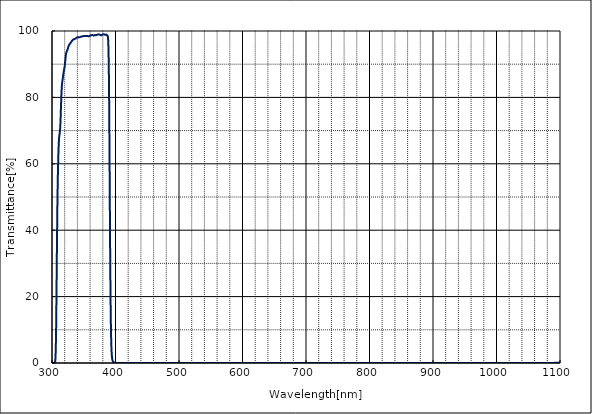
| Category | T% at AOI 0 deg |
|---|---|
| 1100.0 | 0.051 |
| 1099.5 | 0.054 |
| 1099.0 | 0.058 |
| 1098.5 | 0.06 |
| 1098.0 | 0.064 |
| 1097.5 | 0.065 |
| 1097.0 | 0.068 |
| 1096.5 | 0.069 |
| 1096.0 | 0.071 |
| 1095.5 | 0.07 |
| 1095.0 | 0.068 |
| 1094.5 | 0.066 |
| 1094.0 | 0.063 |
| 1093.5 | 0.056 |
| 1093.0 | 0.053 |
| 1092.5 | 0.047 |
| 1092.0 | 0.043 |
| 1091.5 | 0.039 |
| 1091.0 | 0.036 |
| 1090.5 | 0.03 |
| 1090.0 | 0.029 |
| 1089.5 | 0.026 |
| 1089.0 | 0.024 |
| 1088.5 | 0.022 |
| 1088.0 | 0.019 |
| 1087.5 | 0.018 |
| 1087.0 | 0.014 |
| 1086.5 | 0.015 |
| 1086.0 | 0.016 |
| 1085.5 | 0.013 |
| 1085.0 | 0.011 |
| 1084.5 | 0.01 |
| 1084.0 | 0.011 |
| 1083.5 | 0.011 |
| 1083.0 | 0.009 |
| 1082.5 | 0.009 |
| 1082.0 | 0.008 |
| 1081.5 | 0.008 |
| 1081.0 | 0.007 |
| 1080.5 | 0.006 |
| 1080.0 | 0.007 |
| 1079.5 | 0.008 |
| 1079.0 | 0.006 |
| 1078.5 | 0.005 |
| 1078.0 | 0.006 |
| 1077.5 | 0.005 |
| 1077.0 | 0.005 |
| 1076.5 | 0.005 |
| 1076.0 | 0.005 |
| 1075.5 | 0.005 |
| 1075.0 | 0.004 |
| 1074.5 | 0.006 |
| 1074.0 | 0.005 |
| 1073.5 | 0.004 |
| 1073.0 | 0.005 |
| 1072.5 | 0.005 |
| 1072.0 | 0.005 |
| 1071.5 | 0.005 |
| 1071.0 | 0.005 |
| 1070.5 | 0.005 |
| 1070.0 | 0.005 |
| 1069.5 | 0.005 |
| 1069.0 | 0.005 |
| 1068.5 | 0.005 |
| 1068.0 | 0.005 |
| 1067.5 | 0.004 |
| 1067.0 | 0.005 |
| 1066.5 | 0.006 |
| 1066.0 | 0.005 |
| 1065.5 | 0.005 |
| 1065.0 | 0.004 |
| 1064.5 | 0.006 |
| 1064.0 | 0.005 |
| 1063.5 | 0.006 |
| 1063.0 | 0.005 |
| 1062.5 | 0.004 |
| 1062.0 | 0.004 |
| 1061.5 | 0.005 |
| 1061.0 | 0.007 |
| 1060.5 | 0.006 |
| 1060.0 | 0.007 |
| 1059.5 | 0.006 |
| 1059.0 | 0.004 |
| 1058.5 | 0.006 |
| 1058.0 | 0.006 |
| 1057.5 | 0.007 |
| 1057.0 | 0.007 |
| 1056.5 | 0.006 |
| 1056.0 | 0.007 |
| 1055.5 | 0.008 |
| 1055.0 | 0.008 |
| 1054.5 | 0.006 |
| 1054.0 | 0.009 |
| 1053.5 | 0.008 |
| 1053.0 | 0.009 |
| 1052.5 | 0.01 |
| 1052.0 | 0.009 |
| 1051.5 | 0.009 |
| 1051.0 | 0.01 |
| 1050.5 | 0.011 |
| 1050.0 | 0.01 |
| 1049.5 | 0.01 |
| 1049.0 | 0.011 |
| 1048.5 | 0.011 |
| 1048.0 | 0.01 |
| 1047.5 | 0.012 |
| 1047.0 | 0.011 |
| 1046.5 | 0.011 |
| 1046.0 | 0.011 |
| 1045.5 | 0.011 |
| 1045.0 | 0.009 |
| 1044.5 | 0.01 |
| 1044.0 | 0.01 |
| 1043.5 | 0.007 |
| 1043.0 | 0.007 |
| 1042.5 | 0.008 |
| 1042.0 | 0.005 |
| 1041.5 | 0.005 |
| 1041.0 | 0.005 |
| 1040.5 | 0.005 |
| 1040.0 | 0.004 |
| 1039.5 | 0.005 |
| 1039.0 | 0.003 |
| 1038.5 | 0.002 |
| 1038.0 | 0.003 |
| 1037.5 | 0.003 |
| 1037.0 | 0.002 |
| 1036.5 | 0.003 |
| 1036.0 | 0.002 |
| 1035.5 | 0.002 |
| 1035.0 | 0.002 |
| 1034.5 | 0.002 |
| 1034.0 | 0.001 |
| 1033.5 | 0.001 |
| 1033.0 | 0.003 |
| 1032.5 | 0.003 |
| 1032.0 | 0.001 |
| 1031.5 | 0.001 |
| 1031.0 | 0.001 |
| 1030.5 | 0 |
| 1030.0 | 0.002 |
| 1029.5 | 0.002 |
| 1029.0 | 0 |
| 1028.5 | 0.002 |
| 1028.0 | 0.002 |
| 1027.5 | 0.003 |
| 1027.0 | 0.002 |
| 1026.5 | 0.001 |
| 1026.0 | 0.002 |
| 1025.5 | 0.002 |
| 1025.0 | 0 |
| 1024.5 | 0.002 |
| 1024.0 | 0.001 |
| 1023.5 | 0.003 |
| 1023.0 | 0.002 |
| 1022.5 | 0.001 |
| 1022.0 | 0.004 |
| 1021.5 | 0.003 |
| 1021.0 | 0.003 |
| 1020.5 | 0.002 |
| 1020.0 | 0.004 |
| 1019.5 | 0.003 |
| 1019.0 | 0.004 |
| 1018.5 | 0.004 |
| 1018.0 | 0.007 |
| 1017.5 | 0.007 |
| 1017.0 | 0.01 |
| 1016.5 | 0.011 |
| 1016.0 | 0.012 |
| 1015.5 | 0.014 |
| 1015.0 | 0.017 |
| 1014.5 | 0.019 |
| 1014.0 | 0.018 |
| 1013.5 | 0.017 |
| 1013.0 | 0.015 |
| 1012.5 | 0.012 |
| 1012.0 | 0.01 |
| 1011.5 | 0.008 |
| 1011.0 | 0.008 |
| 1010.5 | 0.004 |
| 1010.0 | 0.005 |
| 1009.5 | 0.005 |
| 1009.0 | 0.003 |
| 1008.5 | 0.004 |
| 1008.0 | 0.003 |
| 1007.5 | 0.002 |
| 1007.0 | 0.002 |
| 1006.5 | 0.002 |
| 1006.0 | 0.001 |
| 1005.5 | 0.002 |
| 1005.0 | 0 |
| 1004.5 | 0.003 |
| 1004.0 | 0.001 |
| 1003.5 | 0.002 |
| 1003.0 | 0.001 |
| 1002.5 | 0.002 |
| 1002.0 | 0.002 |
| 1001.5 | 0 |
| 1001.0 | 0.002 |
| 1000.5 | 0.002 |
| 1000.0 | 0.001 |
| 999.5 | 0.001 |
| 999.0 | 0.001 |
| 998.5 | 0.001 |
| 998.0 | 0.001 |
| 997.5 | 0.001 |
| 997.0 | 0.002 |
| 996.5 | 0.002 |
| 996.0 | 0.001 |
| 995.5 | 0.002 |
| 995.0 | 0.002 |
| 994.5 | 0.003 |
| 994.0 | 0.003 |
| 993.5 | 0.003 |
| 993.0 | 0.003 |
| 992.5 | 0.005 |
| 992.0 | 0.005 |
| 991.5 | 0.005 |
| 991.0 | 0.008 |
| 990.5 | 0.011 |
| 990.0 | 0.014 |
| 989.5 | 0.019 |
| 989.0 | 0.024 |
| 988.5 | 0.024 |
| 988.0 | 0.019 |
| 987.5 | 0.015 |
| 987.0 | 0.01 |
| 986.5 | 0.006 |
| 986.0 | 0.004 |
| 985.5 | 0.004 |
| 985.0 | 0.002 |
| 984.5 | 0.001 |
| 984.0 | 0.002 |
| 983.5 | 0.003 |
| 983.0 | 0.002 |
| 982.5 | 0.002 |
| 982.0 | 0.001 |
| 981.5 | 0.001 |
| 981.0 | 0.001 |
| 980.5 | 0 |
| 980.0 | 0.001 |
| 979.5 | -0.001 |
| 979.0 | 0.001 |
| 978.5 | 0.001 |
| 978.0 | 0.001 |
| 977.5 | 0 |
| 977.0 | 0 |
| 976.5 | 0 |
| 976.0 | 0.002 |
| 975.5 | 0.001 |
| 975.0 | 0 |
| 974.5 | 0 |
| 974.0 | 0 |
| 973.5 | 0.001 |
| 973.0 | 0.001 |
| 972.5 | 0.001 |
| 972.0 | 0 |
| 971.5 | 0.001 |
| 971.0 | 0 |
| 970.5 | -0.001 |
| 970.0 | 0 |
| 969.5 | 0 |
| 969.0 | 0.001 |
| 968.5 | 0 |
| 968.0 | 0 |
| 967.5 | -0.001 |
| 967.0 | -0.001 |
| 966.5 | 0.001 |
| 966.0 | 0.001 |
| 965.5 | 0 |
| 965.0 | 0 |
| 964.5 | 0.001 |
| 964.0 | 0.001 |
| 963.5 | 0 |
| 963.0 | 0 |
| 962.5 | 0 |
| 962.0 | 0 |
| 961.5 | 0.001 |
| 961.0 | 0 |
| 960.5 | 0 |
| 960.0 | 0.001 |
| 959.5 | 0.001 |
| 959.0 | 0.002 |
| 958.5 | 0 |
| 958.0 | 0 |
| 957.5 | 0.001 |
| 957.0 | 0.001 |
| 956.5 | -0.001 |
| 956.0 | -0.001 |
| 955.5 | 0 |
| 955.0 | -0.001 |
| 954.5 | 0 |
| 954.0 | 0.001 |
| 953.5 | 0.001 |
| 953.0 | 0.001 |
| 952.5 | 0.001 |
| 952.0 | 0 |
| 951.5 | 0 |
| 951.0 | 0 |
| 950.5 | 0 |
| 950.0 | 0 |
| 949.5 | -0.001 |
| 949.0 | 0 |
| 948.5 | 0 |
| 948.0 | 0 |
| 947.5 | 0.001 |
| 947.0 | 0 |
| 946.5 | 0 |
| 946.0 | 0.002 |
| 945.5 | 0 |
| 945.0 | 0 |
| 944.5 | 0 |
| 944.0 | 0 |
| 943.5 | 0 |
| 943.0 | 0.001 |
| 942.5 | 0.001 |
| 942.0 | 0 |
| 941.5 | 0.001 |
| 941.0 | 0.001 |
| 940.5 | -0.001 |
| 940.0 | 0.001 |
| 939.5 | -0.001 |
| 939.0 | 0 |
| 938.5 | 0 |
| 938.0 | 0 |
| 937.5 | 0.002 |
| 937.0 | 0.002 |
| 936.5 | 0.001 |
| 936.0 | -0.001 |
| 935.5 | 0 |
| 935.0 | 0.001 |
| 934.5 | 0.002 |
| 934.0 | 0 |
| 933.5 | 0.001 |
| 933.0 | 0.001 |
| 932.5 | 0.002 |
| 932.0 | 0.002 |
| 931.5 | 0.004 |
| 931.0 | 0.008 |
| 930.5 | 0.01 |
| 930.0 | 0.009 |
| 929.5 | 0.007 |
| 929.0 | 0.006 |
| 928.5 | 0.003 |
| 928.0 | 0.005 |
| 927.5 | 0.002 |
| 927.0 | 0.003 |
| 926.5 | 0.002 |
| 926.0 | 0.002 |
| 925.5 | 0.001 |
| 925.0 | 0.001 |
| 924.5 | 0.002 |
| 924.0 | 0.002 |
| 923.5 | 0 |
| 923.0 | 0.001 |
| 922.5 | 0 |
| 922.0 | 0.001 |
| 921.5 | 0.001 |
| 921.0 | 0.002 |
| 920.5 | 0.001 |
| 920.0 | 0 |
| 919.5 | 0.001 |
| 919.0 | 0.001 |
| 918.5 | 0.001 |
| 918.0 | 0.002 |
| 917.5 | 0.002 |
| 917.0 | 0.001 |
| 916.5 | 0.001 |
| 916.0 | 0.002 |
| 915.5 | 0.002 |
| 915.0 | 0 |
| 914.5 | 0.001 |
| 914.0 | 0.001 |
| 913.5 | 0.002 |
| 913.0 | 0.003 |
| 912.5 | 0.002 |
| 912.0 | 0.002 |
| 911.5 | 0.002 |
| 911.0 | 0.003 |
| 910.5 | 0.002 |
| 910.0 | 0.003 |
| 909.5 | 0.002 |
| 909.0 | 0.003 |
| 908.5 | 0.002 |
| 908.0 | 0.004 |
| 907.5 | 0.005 |
| 907.0 | 0.005 |
| 906.5 | 0.004 |
| 906.0 | 0.005 |
| 905.5 | 0.005 |
| 905.0 | 0.004 |
| 904.5 | 0.005 |
| 904.0 | 0.003 |
| 903.5 | 0.003 |
| 903.0 | 0.003 |
| 902.5 | 0.003 |
| 902.0 | 0.002 |
| 901.5 | 0.003 |
| 901.0 | 0.001 |
| 900.5 | 0.002 |
| 900.0 | 0.001 |
| 899.5 | 0.001 |
| 899.0 | 0.001 |
| 898.5 | 0.001 |
| 898.0 | 0.002 |
| 897.5 | 0.001 |
| 897.0 | 0.002 |
| 896.5 | 0.001 |
| 896.0 | -0.001 |
| 895.5 | 0 |
| 895.0 | 0 |
| 894.5 | -0.001 |
| 894.0 | 0 |
| 893.5 | 0.001 |
| 893.0 | 0 |
| 892.5 | 0 |
| 892.0 | 0.001 |
| 891.5 | 0 |
| 891.0 | 0.001 |
| 890.5 | 0 |
| 890.0 | -0.001 |
| 889.5 | 0 |
| 889.0 | 0.001 |
| 888.5 | -0.001 |
| 888.0 | 0.003 |
| 887.5 | -0.001 |
| 887.0 | 0 |
| 886.5 | 0 |
| 886.0 | 0 |
| 885.5 | 0.001 |
| 885.0 | -0.001 |
| 884.5 | 0 |
| 884.0 | 0 |
| 883.5 | 0.002 |
| 883.0 | 0.001 |
| 882.5 | 0 |
| 882.0 | 0 |
| 881.5 | 0 |
| 881.0 | 0 |
| 880.5 | 0.001 |
| 880.0 | 0.002 |
| 879.5 | 0 |
| 879.0 | 0.002 |
| 878.5 | 0.001 |
| 878.0 | 0.002 |
| 877.5 | 0.002 |
| 877.0 | 0.003 |
| 876.5 | 0.002 |
| 876.0 | 0.001 |
| 875.5 | 0.001 |
| 875.0 | 0.003 |
| 874.5 | 0.002 |
| 874.0 | 0.001 |
| 873.5 | 0 |
| 873.0 | 0 |
| 872.5 | 0 |
| 872.0 | 0.001 |
| 871.5 | 0.001 |
| 871.0 | 0.002 |
| 870.5 | -0.001 |
| 870.0 | 0 |
| 869.5 | 0 |
| 869.0 | -0.002 |
| 868.5 | 0 |
| 868.0 | 0 |
| 867.5 | 0 |
| 867.0 | 0 |
| 866.5 | 0.001 |
| 866.0 | -0.001 |
| 865.5 | 0.002 |
| 865.0 | -0.001 |
| 864.5 | 0 |
| 864.0 | 0.002 |
| 863.5 | 0.001 |
| 863.0 | 0 |
| 862.5 | -0.001 |
| 862.0 | 0 |
| 861.5 | 0.001 |
| 861.0 | 0 |
| 860.5 | 0.001 |
| 860.0 | 0 |
| 859.5 | 0.001 |
| 859.0 | 0.002 |
| 858.5 | 0 |
| 858.0 | 0.001 |
| 857.5 | 0 |
| 857.0 | 0.001 |
| 856.5 | 0.001 |
| 856.0 | 0.002 |
| 855.5 | -0.001 |
| 855.0 | 0 |
| 854.5 | 0 |
| 854.0 | -0.001 |
| 853.5 | 0.001 |
| 853.0 | 0 |
| 852.5 | 0.001 |
| 852.0 | 0.001 |
| 851.5 | 0 |
| 851.0 | 0 |
| 850.5 | -0.001 |
| 850.0 | 0.001 |
| 849.5 | 0 |
| 849.0 | 0 |
| 848.5 | 0.001 |
| 848.0 | 0 |
| 847.5 | 0 |
| 847.0 | 0 |
| 846.5 | 0 |
| 846.0 | 0 |
| 845.5 | 0 |
| 845.0 | 0 |
| 844.5 | 0 |
| 844.0 | 0 |
| 843.5 | 0 |
| 843.0 | 0 |
| 842.5 | 0 |
| 842.0 | 0 |
| 841.5 | 0 |
| 841.0 | 0 |
| 840.5 | 0 |
| 840.0 | 0 |
| 839.5 | 0 |
| 839.0 | 0 |
| 838.5 | 0 |
| 838.0 | 0 |
| 837.5 | 0 |
| 837.0 | 0 |
| 836.5 | 0 |
| 836.0 | 0 |
| 835.5 | 0 |
| 835.0 | 0 |
| 834.5 | 0 |
| 834.0 | 0 |
| 833.5 | 0 |
| 833.0 | 0 |
| 832.5 | 0 |
| 832.0 | 0 |
| 831.5 | 0 |
| 831.0 | 0 |
| 830.5 | 0 |
| 830.0 | 0 |
| 829.5 | 0 |
| 829.0 | 0 |
| 828.5 | 0 |
| 828.0 | 0 |
| 827.5 | 0 |
| 827.0 | 0 |
| 826.5 | 0 |
| 826.0 | 0 |
| 825.5 | 0 |
| 825.0 | 0 |
| 824.5 | 0 |
| 824.0 | 0 |
| 823.5 | 0 |
| 823.0 | 0 |
| 822.5 | 0 |
| 822.0 | 0 |
| 821.5 | 0 |
| 821.0 | 0 |
| 820.5 | 0 |
| 820.0 | 0 |
| 819.5 | 0 |
| 819.0 | 0 |
| 818.5 | 0 |
| 818.0 | 0 |
| 817.5 | 0 |
| 817.0 | 0 |
| 816.5 | 0 |
| 816.0 | 0 |
| 815.5 | 0 |
| 815.0 | 0 |
| 814.5 | 0 |
| 814.0 | 0 |
| 813.5 | 0 |
| 813.0 | 0 |
| 812.5 | 0 |
| 812.0 | 0 |
| 811.5 | 0 |
| 811.0 | 0 |
| 810.5 | 0 |
| 810.0 | 0 |
| 809.5 | 0 |
| 809.0 | 0 |
| 808.5 | 0 |
| 808.0 | 0.001 |
| 807.5 | 0.001 |
| 807.0 | 0.001 |
| 806.5 | 0.001 |
| 806.0 | 0.001 |
| 805.5 | 0.001 |
| 805.0 | 0.002 |
| 804.5 | 0.002 |
| 804.0 | 0.002 |
| 803.5 | 0.003 |
| 803.0 | 0.003 |
| 802.5 | 0.004 |
| 802.0 | 0.005 |
| 801.5 | 0.005 |
| 801.0 | 0.005 |
| 800.5 | 0.005 |
| 800.0 | 0.005 |
| 799.5 | 0.005 |
| 799.0 | 0.005 |
| 798.5 | 0.004 |
| 798.0 | 0.004 |
| 797.5 | 0.003 |
| 797.0 | 0.003 |
| 796.5 | 0.003 |
| 796.0 | 0.002 |
| 795.5 | 0.002 |
| 795.0 | 0.002 |
| 794.5 | 0.002 |
| 794.0 | 0.001 |
| 793.5 | 0.001 |
| 793.0 | 0.001 |
| 792.5 | 0.001 |
| 792.0 | 0.001 |
| 791.5 | 0.001 |
| 791.0 | 0.001 |
| 790.5 | 0.001 |
| 790.0 | 0.001 |
| 789.5 | 0.001 |
| 789.0 | 0.001 |
| 788.5 | 0.001 |
| 788.0 | 0.001 |
| 787.5 | 0.001 |
| 787.0 | 0.001 |
| 786.5 | 0.001 |
| 786.0 | 0.001 |
| 785.5 | 0.002 |
| 785.0 | 0.001 |
| 784.5 | 0.001 |
| 784.0 | 0.002 |
| 783.5 | 0.001 |
| 783.0 | 0.002 |
| 782.5 | 0.001 |
| 782.0 | 0.002 |
| 781.5 | 0.002 |
| 781.0 | 0.002 |
| 780.5 | 0.002 |
| 780.0 | 0.002 |
| 779.5 | 0.002 |
| 779.0 | 0.002 |
| 778.5 | 0.002 |
| 778.0 | 0.002 |
| 777.5 | 0.002 |
| 777.0 | 0.002 |
| 776.5 | 0.002 |
| 776.0 | 0.001 |
| 775.5 | 0.001 |
| 775.0 | 0.002 |
| 774.5 | 0.002 |
| 774.0 | 0.001 |
| 773.5 | 0.002 |
| 773.0 | 0.001 |
| 772.5 | 0.001 |
| 772.0 | 0.001 |
| 771.5 | 0.001 |
| 771.0 | 0.001 |
| 770.5 | 0.001 |
| 770.0 | 0.001 |
| 769.5 | 0.002 |
| 769.0 | 0.001 |
| 768.5 | 0.001 |
| 768.0 | 0.001 |
| 767.5 | 0.001 |
| 767.0 | 0.002 |
| 766.5 | 0.002 |
| 766.0 | 0.002 |
| 765.5 | 0.002 |
| 765.0 | 0.003 |
| 764.5 | 0.003 |
| 764.0 | 0.003 |
| 763.5 | 0.003 |
| 763.0 | 0.004 |
| 762.5 | 0.004 |
| 762.0 | 0.004 |
| 761.5 | 0.004 |
| 761.0 | 0.004 |
| 760.5 | 0.004 |
| 760.0 | 0.003 |
| 759.5 | 0.003 |
| 759.0 | 0.002 |
| 758.5 | 0.002 |
| 758.0 | 0.002 |
| 757.5 | 0.002 |
| 757.0 | 0.001 |
| 756.5 | 0.001 |
| 756.0 | 0.001 |
| 755.5 | 0.001 |
| 755.0 | 0.001 |
| 754.5 | 0.001 |
| 754.0 | 0.001 |
| 753.5 | 0.001 |
| 753.0 | 0.001 |
| 752.5 | 0.001 |
| 752.0 | 0.001 |
| 751.5 | 0.001 |
| 751.0 | 0.001 |
| 750.5 | 0.001 |
| 750.0 | 0.001 |
| 749.5 | 0.001 |
| 749.0 | 0.001 |
| 748.5 | 0.001 |
| 748.0 | 0.001 |
| 747.5 | 0.001 |
| 747.0 | 0.001 |
| 746.5 | 0.001 |
| 746.0 | 0.001 |
| 745.5 | 0.002 |
| 745.0 | 0.002 |
| 744.5 | 0.002 |
| 744.0 | 0.003 |
| 743.5 | 0.003 |
| 743.0 | 0.004 |
| 742.5 | 0.004 |
| 742.0 | 0.004 |
| 741.5 | 0.004 |
| 741.0 | 0.004 |
| 740.5 | 0.003 |
| 740.0 | 0.003 |
| 739.5 | 0.002 |
| 739.0 | 0.002 |
| 738.5 | 0.001 |
| 738.0 | 0.001 |
| 737.5 | 0.001 |
| 737.0 | 0.001 |
| 736.5 | 0.001 |
| 736.0 | 0.001 |
| 735.5 | 0.001 |
| 735.0 | 0.001 |
| 734.5 | 0.001 |
| 734.0 | 0.001 |
| 733.5 | 0.001 |
| 733.0 | 0.001 |
| 732.5 | 0.001 |
| 732.0 | 0.001 |
| 731.5 | 0.001 |
| 731.0 | 0.001 |
| 730.5 | 0.002 |
| 730.0 | 0.002 |
| 729.5 | 0.002 |
| 729.0 | 0.003 |
| 728.5 | 0.003 |
| 728.0 | 0.004 |
| 727.5 | 0.005 |
| 727.0 | 0.006 |
| 726.5 | 0.006 |
| 726.0 | 0.005 |
| 725.5 | 0.004 |
| 725.0 | 0.003 |
| 724.5 | 0.003 |
| 724.0 | 0.002 |
| 723.5 | 0.001 |
| 723.0 | 0.001 |
| 722.5 | 0.001 |
| 722.0 | 0.001 |
| 721.5 | 0.001 |
| 721.0 | 0.001 |
| 720.5 | 0 |
| 720.0 | 0.001 |
| 719.5 | 0 |
| 719.0 | 0 |
| 718.5 | 0 |
| 718.0 | 0 |
| 717.5 | 0 |
| 717.0 | 0 |
| 716.5 | 0 |
| 716.0 | 0 |
| 715.5 | 0 |
| 715.0 | 0 |
| 714.5 | 0 |
| 714.0 | 0 |
| 713.5 | 0 |
| 713.0 | 0 |
| 712.5 | 0 |
| 712.0 | 0 |
| 711.5 | 0 |
| 711.0 | 0 |
| 710.5 | 0 |
| 710.0 | 0 |
| 709.5 | 0.001 |
| 709.0 | 0 |
| 708.5 | 0 |
| 708.0 | 0.001 |
| 707.5 | 0 |
| 707.0 | 0.001 |
| 706.5 | 0.001 |
| 706.0 | 0.001 |
| 705.5 | 0.002 |
| 705.0 | 0.002 |
| 704.5 | 0.003 |
| 704.0 | 0.004 |
| 703.5 | 0.005 |
| 703.0 | 0.006 |
| 702.5 | 0.008 |
| 702.0 | 0.009 |
| 701.5 | 0.01 |
| 701.0 | 0.009 |
| 700.5 | 0.009 |
| 700.0 | 0.008 |
| 699.5 | 0.007 |
| 699.0 | 0.006 |
| 698.5 | 0.005 |
| 698.0 | 0.005 |
| 697.5 | 0.004 |
| 697.0 | 0.004 |
| 696.5 | 0.004 |
| 696.0 | 0.004 |
| 695.5 | 0.004 |
| 695.0 | 0.005 |
| 694.5 | 0.005 |
| 694.0 | 0.005 |
| 693.5 | 0.005 |
| 693.0 | 0.006 |
| 692.5 | 0.006 |
| 692.0 | 0.006 |
| 691.5 | 0.006 |
| 691.0 | 0.005 |
| 690.5 | 0.005 |
| 690.0 | 0.005 |
| 689.5 | 0.004 |
| 689.0 | 0.004 |
| 688.5 | 0.003 |
| 688.0 | 0.003 |
| 687.5 | 0.003 |
| 687.0 | 0.003 |
| 686.5 | 0.002 |
| 686.0 | 0.002 |
| 685.5 | 0.002 |
| 685.0 | 0.002 |
| 684.5 | 0.002 |
| 684.0 | 0.002 |
| 683.5 | 0.002 |
| 683.0 | 0.002 |
| 682.5 | 0.002 |
| 682.0 | 0.002 |
| 681.5 | 0.002 |
| 681.0 | 0.002 |
| 680.5 | 0.002 |
| 680.0 | 0.003 |
| 679.5 | 0.003 |
| 679.0 | 0.003 |
| 678.5 | 0.003 |
| 678.0 | 0.004 |
| 677.5 | 0.004 |
| 677.0 | 0.004 |
| 676.5 | 0.005 |
| 676.0 | 0.005 |
| 675.5 | 0.005 |
| 675.0 | 0.005 |
| 674.5 | 0.005 |
| 674.0 | 0.005 |
| 673.5 | 0.004 |
| 673.0 | 0.004 |
| 672.5 | 0.004 |
| 672.0 | 0.004 |
| 671.5 | 0.004 |
| 671.0 | 0.004 |
| 670.5 | 0.003 |
| 670.0 | 0.003 |
| 669.5 | 0.003 |
| 669.0 | 0.003 |
| 668.5 | 0.003 |
| 668.0 | 0.003 |
| 667.5 | 0.003 |
| 667.0 | 0.003 |
| 666.5 | 0.003 |
| 666.0 | 0.003 |
| 665.5 | 0.003 |
| 665.0 | 0.003 |
| 664.5 | 0.003 |
| 664.0 | 0.003 |
| 663.5 | 0.003 |
| 663.0 | 0.003 |
| 662.5 | 0.003 |
| 662.0 | 0.003 |
| 661.5 | 0.002 |
| 661.0 | 0.003 |
| 660.5 | 0.002 |
| 660.0 | 0.002 |
| 659.5 | 0.002 |
| 659.0 | 0.002 |
| 658.5 | 0.002 |
| 658.0 | 0.002 |
| 657.5 | 0.002 |
| 657.0 | 0.002 |
| 656.5 | 0.003 |
| 656.0 | 0.003 |
| 655.5 | 0.003 |
| 655.0 | 0.003 |
| 654.5 | 0.003 |
| 654.0 | 0.004 |
| 653.5 | 0.004 |
| 653.0 | 0.004 |
| 652.5 | 0.004 |
| 652.0 | 0.004 |
| 651.5 | 0.004 |
| 651.0 | 0.005 |
| 650.5 | 0.005 |
| 650.0 | 0.005 |
| 649.5 | 0.005 |
| 649.0 | 0.004 |
| 648.5 | 0.004 |
| 648.0 | 0.004 |
| 647.5 | 0.004 |
| 647.0 | 0.004 |
| 646.5 | 0.003 |
| 646.0 | 0.003 |
| 645.5 | 0.003 |
| 645.0 | 0.002 |
| 644.5 | 0.003 |
| 644.0 | 0.002 |
| 643.5 | 0.002 |
| 643.0 | 0.002 |
| 642.5 | 0.002 |
| 642.0 | 0.002 |
| 641.5 | 0.002 |
| 641.0 | 0.002 |
| 640.5 | 0.002 |
| 640.0 | 0.001 |
| 639.5 | 0.002 |
| 639.0 | 0.002 |
| 638.5 | 0.001 |
| 638.0 | 0.002 |
| 637.5 | 0.002 |
| 637.0 | 0.002 |
| 636.5 | 0.002 |
| 636.0 | 0.002 |
| 635.5 | 0.002 |
| 635.0 | 0.002 |
| 634.5 | 0.002 |
| 634.0 | 0.002 |
| 633.5 | 0.002 |
| 633.0 | 0.002 |
| 632.5 | 0.003 |
| 632.0 | 0.003 |
| 631.5 | 0.003 |
| 631.0 | 0.003 |
| 630.5 | 0.003 |
| 630.0 | 0.003 |
| 629.5 | 0.003 |
| 629.0 | 0.003 |
| 628.5 | 0.003 |
| 628.0 | 0.003 |
| 627.5 | 0.003 |
| 627.0 | 0.003 |
| 626.5 | 0.003 |
| 626.0 | 0.003 |
| 625.5 | 0.003 |
| 625.0 | 0.003 |
| 624.5 | 0.002 |
| 624.0 | 0.002 |
| 623.5 | 0.002 |
| 623.0 | 0.002 |
| 622.5 | 0.002 |
| 622.0 | 0.003 |
| 621.5 | 0.003 |
| 621.0 | 0.002 |
| 620.5 | 0.003 |
| 620.0 | 0.003 |
| 619.5 | 0.003 |
| 619.0 | 0.003 |
| 618.5 | 0.003 |
| 618.0 | 0.003 |
| 617.5 | 0.003 |
| 617.0 | 0.003 |
| 616.5 | 0.003 |
| 616.0 | 0.002 |
| 615.5 | 0.003 |
| 615.0 | 0.002 |
| 614.5 | 0.002 |
| 614.0 | 0.002 |
| 613.5 | 0.002 |
| 613.0 | 0.002 |
| 612.5 | 0.002 |
| 612.0 | 0.002 |
| 611.5 | 0.002 |
| 611.0 | 0.002 |
| 610.5 | 0.002 |
| 610.0 | 0.002 |
| 609.5 | 0.002 |
| 609.0 | 0.002 |
| 608.5 | 0.002 |
| 608.0 | 0.002 |
| 607.5 | 0.002 |
| 607.0 | 0.002 |
| 606.5 | 0.002 |
| 606.0 | 0.002 |
| 605.5 | 0.001 |
| 605.0 | 0.002 |
| 604.5 | 0.002 |
| 604.0 | 0.002 |
| 603.5 | 0.001 |
| 603.0 | 0.002 |
| 602.5 | 0.002 |
| 602.0 | 0.002 |
| 601.5 | 0.002 |
| 601.0 | 0.002 |
| 600.5 | 0.002 |
| 600.0 | 0.002 |
| 599.5 | 0.002 |
| 599.0 | 0.002 |
| 598.5 | 0.002 |
| 598.0 | 0.002 |
| 597.5 | 0.003 |
| 597.0 | 0.002 |
| 596.5 | 0.003 |
| 596.0 | 0.003 |
| 595.5 | 0.003 |
| 595.0 | 0.003 |
| 594.5 | 0.003 |
| 594.0 | 0.002 |
| 593.5 | 0.002 |
| 593.0 | 0.003 |
| 592.5 | 0.002 |
| 592.0 | 0.002 |
| 591.5 | 0.002 |
| 591.0 | 0.002 |
| 590.5 | 0.002 |
| 590.0 | 0.002 |
| 589.5 | 0.002 |
| 589.0 | 0.002 |
| 588.5 | 0.002 |
| 588.0 | 0.002 |
| 587.5 | 0.002 |
| 587.0 | 0.002 |
| 586.5 | 0.002 |
| 586.0 | 0.001 |
| 585.5 | 0.002 |
| 585.0 | 0.001 |
| 584.5 | 0.001 |
| 584.0 | 0.001 |
| 583.5 | 0.001 |
| 583.0 | 0.001 |
| 582.5 | 0.001 |
| 582.0 | 0.001 |
| 581.5 | 0.001 |
| 581.0 | 0.001 |
| 580.5 | 0.001 |
| 580.0 | 0.001 |
| 579.5 | 0.001 |
| 579.0 | 0.002 |
| 578.5 | 0.001 |
| 578.0 | 0.002 |
| 577.5 | 0.002 |
| 577.0 | 0.002 |
| 576.5 | 0.003 |
| 576.0 | 0.003 |
| 575.5 | 0.004 |
| 575.0 | 0.004 |
| 574.5 | 0.004 |
| 574.0 | 0.004 |
| 573.5 | 0.004 |
| 573.0 | 0.003 |
| 572.5 | 0.003 |
| 572.0 | 0.002 |
| 571.5 | 0.002 |
| 571.0 | 0.002 |
| 570.5 | 0.002 |
| 570.0 | 0.002 |
| 569.5 | 0.001 |
| 569.0 | 0.001 |
| 568.5 | 0.001 |
| 568.0 | 0.001 |
| 567.5 | 0.001 |
| 567.0 | 0.001 |
| 566.5 | 0.001 |
| 566.0 | 0.001 |
| 565.5 | 0.001 |
| 565.0 | 0.001 |
| 564.5 | 0.001 |
| 564.0 | 0.001 |
| 563.5 | 0.001 |
| 563.0 | 0.001 |
| 562.5 | 0.001 |
| 562.0 | 0.001 |
| 561.5 | 0.001 |
| 561.0 | 0.001 |
| 560.5 | 0.001 |
| 560.0 | 0.001 |
| 559.5 | 0.001 |
| 559.0 | 0.001 |
| 558.5 | 0.001 |
| 558.0 | 0.001 |
| 557.5 | 0.001 |
| 557.0 | 0.002 |
| 556.5 | 0.002 |
| 556.0 | 0.001 |
| 555.5 | 0.002 |
| 555.0 | 0.002 |
| 554.5 | 0.002 |
| 554.0 | 0.002 |
| 553.5 | 0.002 |
| 553.0 | 0.002 |
| 552.5 | 0.002 |
| 552.0 | 0.001 |
| 551.5 | 0.001 |
| 551.0 | 0.001 |
| 550.5 | 0.001 |
| 550.0 | 0.001 |
| 549.5 | 0.001 |
| 549.0 | 0.001 |
| 548.5 | 0.001 |
| 548.0 | 0.001 |
| 547.5 | 0.001 |
| 547.0 | 0.001 |
| 546.5 | 0 |
| 546.0 | 0.001 |
| 545.5 | 0 |
| 545.0 | 0.001 |
| 544.5 | 0.001 |
| 544.0 | 0 |
| 543.5 | 0.001 |
| 543.0 | 0 |
| 542.5 | 0 |
| 542.0 | 0 |
| 541.5 | 0 |
| 541.0 | 0 |
| 540.5 | 0.001 |
| 540.0 | 0 |
| 539.5 | 0 |
| 539.0 | 0 |
| 538.5 | 0.001 |
| 538.0 | 0.001 |
| 537.5 | 0 |
| 537.0 | 0.001 |
| 536.5 | 0.001 |
| 536.0 | 0.001 |
| 535.5 | 0.001 |
| 535.0 | 0.001 |
| 534.5 | 0.002 |
| 534.0 | 0.002 |
| 533.5 | 0.002 |
| 533.0 | 0.002 |
| 532.5 | 0.002 |
| 532.0 | 0.002 |
| 531.5 | 0.002 |
| 531.0 | 0.002 |
| 530.5 | 0.001 |
| 530.0 | 0.001 |
| 529.5 | 0.001 |
| 529.0 | 0 |
| 528.5 | 0.001 |
| 528.0 | 0 |
| 527.5 | 0 |
| 527.0 | 0 |
| 526.5 | 0 |
| 526.0 | 0 |
| 525.5 | 0 |
| 525.0 | 0 |
| 524.5 | 0 |
| 524.0 | 0 |
| 523.5 | 0 |
| 523.0 | 0 |
| 522.5 | 0 |
| 522.0 | 0 |
| 521.5 | 0 |
| 521.0 | 0 |
| 520.5 | 0 |
| 520.0 | 0 |
| 519.5 | 0 |
| 519.0 | 0 |
| 518.5 | 0 |
| 518.0 | 0 |
| 517.5 | 0 |
| 517.0 | 0 |
| 516.5 | 0 |
| 516.0 | 0.001 |
| 515.5 | 0 |
| 515.0 | 0 |
| 514.5 | 0 |
| 514.0 | 0.001 |
| 513.5 | 0.001 |
| 513.0 | 0.001 |
| 512.5 | 0.001 |
| 512.0 | 0.001 |
| 511.5 | 0.002 |
| 511.0 | 0.002 |
| 510.5 | 0.002 |
| 510.0 | 0.002 |
| 509.5 | 0.002 |
| 509.0 | 0.002 |
| 508.5 | 0.002 |
| 508.0 | 0.002 |
| 507.5 | 0.001 |
| 507.0 | 0.001 |
| 506.5 | 0.001 |
| 506.0 | 0 |
| 505.5 | 0.001 |
| 505.0 | 0.001 |
| 504.5 | 0 |
| 504.0 | 0 |
| 503.5 | 0 |
| 503.0 | 0.001 |
| 502.5 | 0.001 |
| 502.0 | 0.001 |
| 501.5 | 0.001 |
| 501.0 | 0.001 |
| 500.5 | 0.001 |
| 500.0 | 0.001 |
| 499.5 | 0.001 |
| 499.0 | 0.001 |
| 498.5 | 0.001 |
| 498.0 | 0.001 |
| 497.5 | 0.001 |
| 497.0 | 0.001 |
| 496.5 | 0.001 |
| 496.0 | 0 |
| 495.5 | 0 |
| 495.0 | 0 |
| 494.5 | 0 |
| 494.0 | 0 |
| 493.5 | 0 |
| 493.0 | 0 |
| 492.5 | 0 |
| 492.0 | 0 |
| 491.5 | 0 |
| 491.0 | 0 |
| 490.5 | 0 |
| 490.0 | 0 |
| 489.5 | 0 |
| 489.0 | 0 |
| 488.5 | 0 |
| 488.0 | 0 |
| 487.5 | 0 |
| 487.0 | 0 |
| 486.5 | 0 |
| 486.0 | 0 |
| 485.5 | 0 |
| 485.0 | 0 |
| 484.5 | 0 |
| 484.0 | 0 |
| 483.5 | 0 |
| 483.0 | 0 |
| 482.5 | 0 |
| 482.0 | 0 |
| 481.5 | 0 |
| 481.0 | 0 |
| 480.5 | 0 |
| 480.0 | 0 |
| 479.5 | 0 |
| 479.0 | 0 |
| 478.5 | 0 |
| 478.0 | 0 |
| 477.5 | 0 |
| 477.0 | 0 |
| 476.5 | 0 |
| 476.0 | 0 |
| 475.5 | 0 |
| 475.0 | 0 |
| 474.5 | 0 |
| 474.0 | 0 |
| 473.5 | 0 |
| 473.0 | 0 |
| 472.5 | 0 |
| 472.0 | 0 |
| 471.5 | 0 |
| 471.0 | 0 |
| 470.5 | 0 |
| 470.0 | 0 |
| 469.5 | 0 |
| 469.0 | 0 |
| 468.5 | 0 |
| 468.0 | 0 |
| 467.5 | 0 |
| 467.0 | 0 |
| 466.5 | 0 |
| 466.0 | 0 |
| 465.5 | 0 |
| 465.0 | 0 |
| 464.5 | 0 |
| 464.0 | 0 |
| 463.5 | 0 |
| 463.0 | 0 |
| 462.5 | 0 |
| 462.0 | 0 |
| 461.5 | 0 |
| 461.0 | 0 |
| 460.5 | 0 |
| 460.0 | 0 |
| 459.5 | 0 |
| 459.0 | 0 |
| 458.5 | 0 |
| 458.0 | 0 |
| 457.5 | 0 |
| 457.0 | 0 |
| 456.5 | 0 |
| 456.0 | 0 |
| 455.5 | 0 |
| 455.0 | 0 |
| 454.5 | 0 |
| 454.0 | 0 |
| 453.5 | 0 |
| 453.0 | 0 |
| 452.5 | 0 |
| 452.0 | 0 |
| 451.5 | 0 |
| 451.0 | 0 |
| 450.5 | 0 |
| 450.0 | 0 |
| 449.5 | 0 |
| 449.0 | 0 |
| 448.5 | 0 |
| 448.0 | 0 |
| 447.5 | 0 |
| 447.0 | 0 |
| 446.5 | 0 |
| 446.0 | 0 |
| 445.5 | 0 |
| 445.0 | 0 |
| 444.5 | 0 |
| 444.0 | 0 |
| 443.5 | 0 |
| 443.0 | 0 |
| 442.5 | 0 |
| 442.0 | 0 |
| 441.5 | 0 |
| 441.0 | 0 |
| 440.5 | 0 |
| 440.0 | 0 |
| 439.5 | 0 |
| 439.0 | 0 |
| 438.5 | 0 |
| 438.0 | 0 |
| 437.5 | 0 |
| 437.0 | 0 |
| 436.5 | 0 |
| 436.0 | 0 |
| 435.5 | 0 |
| 435.0 | 0 |
| 434.5 | 0 |
| 434.0 | 0 |
| 433.5 | 0 |
| 433.0 | 0 |
| 432.5 | 0 |
| 432.0 | 0 |
| 431.5 | 0 |
| 431.0 | 0 |
| 430.5 | 0 |
| 430.0 | 0 |
| 429.5 | 0 |
| 429.0 | 0 |
| 428.5 | 0 |
| 428.0 | 0 |
| 427.5 | 0 |
| 427.0 | 0 |
| 426.5 | 0 |
| 426.0 | 0 |
| 425.5 | 0 |
| 425.0 | 0 |
| 424.5 | 0 |
| 424.0 | 0 |
| 423.5 | 0 |
| 423.0 | 0 |
| 422.5 | 0 |
| 422.0 | 0 |
| 421.5 | 0 |
| 421.0 | 0 |
| 420.5 | 0 |
| 420.0 | 0 |
| 419.5 | 0 |
| 419.0 | 0 |
| 418.5 | 0 |
| 418.0 | 0 |
| 417.5 | 0 |
| 417.0 | 0 |
| 416.5 | 0 |
| 416.0 | 0 |
| 415.5 | 0 |
| 415.0 | 0 |
| 414.5 | 0 |
| 414.0 | 0 |
| 413.5 | 0 |
| 413.0 | 0 |
| 412.5 | 0 |
| 412.0 | 0 |
| 411.5 | 0 |
| 411.0 | 0 |
| 410.5 | 0 |
| 410.0 | 0 |
| 409.5 | 0 |
| 409.0 | 0 |
| 408.5 | 0 |
| 408.0 | 0 |
| 407.5 | 0 |
| 407.0 | 0.001 |
| 406.5 | 0.001 |
| 406.0 | 0.001 |
| 405.5 | 0.001 |
| 405.0 | 0.002 |
| 404.5 | 0.002 |
| 404.0 | 0.002 |
| 403.5 | 0.003 |
| 403.0 | 0.004 |
| 402.5 | 0.005 |
| 402.0 | 0.006 |
| 401.5 | 0.008 |
| 401.0 | 0.011 |
| 400.5 | 0.015 |
| 400.0 | 0.021 |
| 399.5 | 0.03 |
| 399.0 | 0.04 |
| 398.5 | 0.056 |
| 398.0 | 0.079 |
| 397.5 | 0.115 |
| 397.0 | 0.174 |
| 396.5 | 0.266 |
| 396.0 | 0.405 |
| 395.5 | 0.636 |
| 395.0 | 1.01 |
| 394.5 | 1.674 |
| 394.0 | 2.905 |
| 393.5 | 4.984 |
| 393.0 | 8.496 |
| 392.5 | 14.405 |
| 392.0 | 23.347 |
| 391.5 | 35.559 |
| 391.0 | 50.187 |
| 390.5 | 65.341 |
| 390.0 | 78.553 |
| 389.5 | 88.268 |
| 389.0 | 94.292 |
| 388.5 | 97.177 |
| 388.0 | 98.261 |
| 387.5 | 98.613 |
| 387.0 | 98.737 |
| 386.5 | 98.799 |
| 386.0 | 98.871 |
| 385.5 | 98.911 |
| 385.0 | 98.929 |
| 384.5 | 98.914 |
| 384.0 | 98.898 |
| 383.5 | 98.882 |
| 383.0 | 98.945 |
| 382.5 | 98.966 |
| 382.0 | 98.991 |
| 381.5 | 99.017 |
| 381.0 | 99.021 |
| 380.5 | 99.014 |
| 380.0 | 98.994 |
| 379.5 | 98.933 |
| 379.0 | 98.857 |
| 378.5 | 98.816 |
| 378.0 | 98.746 |
| 377.5 | 98.687 |
| 377.0 | 98.692 |
| 376.5 | 98.717 |
| 376.0 | 98.775 |
| 375.5 | 98.868 |
| 375.0 | 98.961 |
| 374.5 | 99.027 |
| 374.0 | 99.023 |
| 373.5 | 99.01 |
| 373.0 | 99.006 |
| 372.5 | 98.981 |
| 372.0 | 98.959 |
| 371.5 | 98.893 |
| 371.0 | 98.832 |
| 370.5 | 98.776 |
| 370.0 | 98.718 |
| 369.5 | 98.733 |
| 369.0 | 98.736 |
| 368.5 | 98.761 |
| 368.0 | 98.772 |
| 367.5 | 98.775 |
| 367.0 | 98.751 |
| 366.5 | 98.711 |
| 366.0 | 98.668 |
| 365.5 | 98.622 |
| 365.0 | 98.625 |
| 364.5 | 98.668 |
| 364.0 | 98.727 |
| 363.5 | 98.772 |
| 363.0 | 98.794 |
| 362.5 | 98.795 |
| 362.0 | 98.808 |
| 361.5 | 98.749 |
| 361.0 | 98.705 |
| 360.5 | 98.646 |
| 360.0 | 98.615 |
| 359.5 | 98.538 |
| 359.0 | 98.453 |
| 358.5 | 98.426 |
| 358.0 | 98.407 |
| 357.5 | 98.408 |
| 357.0 | 98.421 |
| 356.5 | 98.46 |
| 356.0 | 98.495 |
| 355.5 | 98.5 |
| 355.0 | 98.498 |
| 354.5 | 98.485 |
| 354.0 | 98.471 |
| 353.5 | 98.46 |
| 353.0 | 98.464 |
| 352.5 | 98.505 |
| 352.0 | 98.514 |
| 351.5 | 98.489 |
| 351.0 | 98.494 |
| 350.5 | 98.428 |
| 350.0 | 98.426 |
| 349.5 | 98.484 |
| 349.0 | 98.485 |
| 348.5 | 98.415 |
| 348.0 | 98.423 |
| 347.5 | 98.368 |
| 347.0 | 98.322 |
| 346.5 | 98.333 |
| 346.0 | 98.328 |
| 345.5 | 98.297 |
| 345.0 | 98.307 |
| 344.5 | 98.244 |
| 344.0 | 98.164 |
| 343.5 | 98.12 |
| 343.0 | 98.112 |
| 342.5 | 98.125 |
| 342.0 | 98.186 |
| 341.5 | 98.157 |
| 341.0 | 98.141 |
| 340.5 | 98.138 |
| 340.0 | 98.091 |
| 339.5 | 98.064 |
| 339.0 | 98.005 |
| 338.5 | 97.911 |
| 338.0 | 97.837 |
| 337.5 | 97.768 |
| 337.0 | 97.682 |
| 336.5 | 97.618 |
| 336.0 | 97.621 |
| 335.5 | 97.577 |
| 335.0 | 97.52 |
| 334.5 | 97.531 |
| 334.0 | 97.47 |
| 333.5 | 97.454 |
| 333.0 | 97.405 |
| 332.5 | 97.289 |
| 332.0 | 97.192 |
| 331.5 | 97.06 |
| 331.0 | 96.923 |
| 330.5 | 96.732 |
| 330.0 | 96.597 |
| 329.5 | 96.459 |
| 329.0 | 96.345 |
| 328.5 | 96.217 |
| 328.0 | 96.133 |
| 327.5 | 95.968 |
| 327.0 | 95.785 |
| 326.5 | 95.593 |
| 326.0 | 95.35 |
| 325.5 | 95.041 |
| 325.0 | 94.726 |
| 324.5 | 94.414 |
| 324.0 | 94.155 |
| 323.5 | 93.96 |
| 323.0 | 93.709 |
| 322.5 | 93.465 |
| 322.0 | 93.017 |
| 321.5 | 92.195 |
| 321.0 | 91.224 |
| 320.5 | 90.213 |
| 320.0 | 89.326 |
| 319.5 | 88.806 |
| 319.0 | 88.354 |
| 318.5 | 87.77 |
| 318.0 | 87.213 |
| 317.5 | 86.448 |
| 317.0 | 85.734 |
| 316.5 | 85.183 |
| 316.0 | 84.463 |
| 315.5 | 83.445 |
| 315.0 | 81.742 |
| 314.5 | 79.194 |
| 314.0 | 76.405 |
| 313.5 | 73.41 |
| 313.0 | 71.118 |
| 312.5 | 69.894 |
| 312.0 | 68.981 |
| 311.5 | 68.425 |
| 311.0 | 67.444 |
| 310.5 | 65.366 |
| 310.0 | 62.654 |
| 309.5 | 58.956 |
| 309.0 | 54.171 |
| 308.5 | 47.797 |
| 308.0 | 39.27 |
| 307.5 | 29.475 |
| 307.0 | 19.196 |
| 306.5 | 10.447 |
| 306.0 | 4.698 |
| 305.5 | 1.485 |
| 305.0 | 0.366 |
| 304.5 | 0.154 |
| 304.0 | 0.082 |
| 303.5 | 0.043 |
| 303.0 | 0.022 |
| 302.5 | 0.014 |
| 302.0 | 0.01 |
| 301.5 | 0.007 |
| 301.0 | 0.005 |
| 300.5 | 0.004 |
| 300.0 | 0.002 |